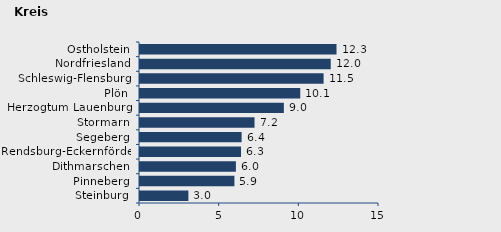
| Category | Wanderungssaldo |
|---|---|
| Steinburg | 3.037 |
| Pinneberg | 5.926 |
| Dithmarschen | 6.019 |
| Rendsburg-Eckernförde | 6.34 |
| Segeberg | 6.378 |
| Stormarn | 7.188 |
| Herzogtum Lauenburg | 9.028 |
| Plön | 10.058 |
| Schleswig-Flensburg | 11.522 |
| Nordfriesland | 11.971 |
| Ostholstein | 12.333 |